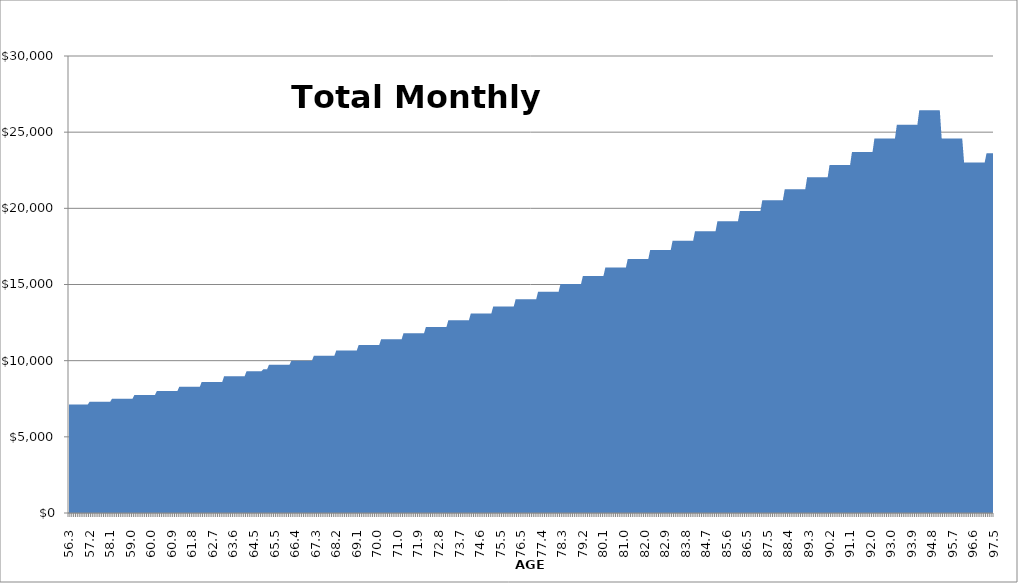
| Category | Total Monthly Expenses |
|---|---|
| 56.3 | 7116.195 |
| 56.4 | 7116.195 |
| 56.5 | 7116.195 |
| 56.5 | 7116.195 |
| 56.6 | 7116.195 |
| 56.7 | 7116.195 |
| 56.8 | 7116.195 |
| 56.9 | 7116.195 |
| 57.0 | 7116.195 |
| 57.0 | 7116.195 |
| 57.1 | 7116.195 |
| 57.2 | 7297.898 |
| 57.3 | 7297.898 |
| 57.4 | 7297.898 |
| 57.5 | 7297.898 |
| 57.5 | 7297.898 |
| 57.6 | 7297.898 |
| 57.7 | 7297.898 |
| 57.8 | 7297.898 |
| 57.9 | 7297.898 |
| 58.0 | 7297.898 |
| 58.0 | 7297.898 |
| 58.1 | 7297.898 |
| 58.2 | 7500.797 |
| 58.3 | 7500.797 |
| 58.4 | 7500.797 |
| 58.5 | 7500.797 |
| 58.5 | 7500.797 |
| 58.6 | 7500.797 |
| 58.7 | 7500.797 |
| 58.8 | 7500.797 |
| 58.9 | 7500.797 |
| 59.0 | 7500.797 |
| 59.0 | 7500.797 |
| 59.1 | 7500.797 |
| 59.2 | 7746.349 |
| 59.3 | 7746.349 |
| 59.4 | 7746.349 |
| 59.5 | 7746.349 |
| 59.5 | 7746.349 |
| 59.6 | 7746.349 |
| 59.7 | 7746.349 |
| 59.8 | 7746.349 |
| 59.9 | 7746.349 |
| 60.0 | 7746.349 |
| 60.0 | 7746.349 |
| 60.1 | 7746.349 |
| 60.2 | 8009.416 |
| 60.3 | 8009.416 |
| 60.4 | 8009.416 |
| 60.5 | 8009.416 |
| 60.5 | 8009.416 |
| 60.6 | 8009.416 |
| 60.7 | 8009.416 |
| 60.8 | 8009.416 |
| 60.9 | 8009.416 |
| 61.0 | 8009.416 |
| 61.0 | 8009.416 |
| 61.1 | 8009.416 |
| 61.2 | 8283.928 |
| 61.3 | 8283.928 |
| 61.4 | 8283.928 |
| 61.5 | 8283.928 |
| 61.5 | 8283.928 |
| 61.6 | 8283.928 |
| 61.7 | 8283.928 |
| 61.8 | 8283.928 |
| 61.9 | 8283.928 |
| 62.0 | 8283.928 |
| 62.0 | 8283.928 |
| 62.1 | 8283.928 |
| 62.2 | 8606.716 |
| 62.3 | 8606.716 |
| 62.4 | 8606.716 |
| 62.5 | 8606.716 |
| 62.5 | 8606.716 |
| 62.6 | 8606.716 |
| 62.7 | 8606.716 |
| 62.8 | 8606.716 |
| 62.9 | 8606.716 |
| 63.0 | 8606.716 |
| 63.0 | 8606.716 |
| 63.1 | 8606.716 |
| 63.2 | 8980.639 |
| 63.3 | 8980.639 |
| 63.4 | 8980.639 |
| 63.5 | 8980.639 |
| 63.5 | 8980.639 |
| 63.6 | 8980.639 |
| 63.7 | 8980.639 |
| 63.8 | 8980.639 |
| 63.9 | 8980.639 |
| 64.0 | 8980.639 |
| 64.0 | 8980.639 |
| 64.1 | 8980.639 |
| 64.2 | 9305.634 |
| 64.3 | 9305.634 |
| 64.4 | 9305.634 |
| 64.5 | 9305.634 |
| 64.5 | 9305.634 |
| 64.6 | 9305.634 |
| 64.7 | 9305.634 |
| 64.8 | 9305.634 |
| 64.9 | 9305.634 |
| 65.0 | 9430.967 |
| 65.0 | 9430.967 |
| 65.1 | 9430.967 |
| 65.2 | 9731.412 |
| 65.3 | 9731.412 |
| 65.4 | 9731.412 |
| 65.5 | 9731.412 |
| 65.5 | 9731.412 |
| 65.6 | 9731.412 |
| 65.7 | 9731.412 |
| 65.8 | 9731.412 |
| 65.9 | 9731.412 |
| 66.0 | 9731.412 |
| 66.0 | 9731.412 |
| 66.1 | 9731.412 |
| 66.2 | 9993.343 |
| 66.3 | 9993.343 |
| 66.4 | 9993.343 |
| 66.5 | 9993.343 |
| 66.5 | 9993.343 |
| 66.6 | 9993.343 |
| 66.7 | 9993.343 |
| 66.8 | 9993.343 |
| 66.9 | 9993.343 |
| 67.0 | 9993.343 |
| 67.0 | 9993.343 |
| 67.1 | 9993.343 |
| 67.2 | 10315.372 |
| 67.3 | 10315.372 |
| 67.4 | 10315.372 |
| 67.5 | 10315.372 |
| 67.5 | 10315.372 |
| 67.6 | 10315.372 |
| 67.7 | 10315.372 |
| 67.8 | 10315.372 |
| 67.9 | 10315.372 |
| 68.0 | 10315.372 |
| 68.0 | 10315.372 |
| 68.1 | 10315.372 |
| 68.2 | 10661.451 |
| 68.3 | 10661.451 |
| 68.4 | 10661.451 |
| 68.5 | 10661.451 |
| 68.5 | 10661.451 |
| 68.6 | 10661.451 |
| 68.7 | 10661.451 |
| 68.8 | 10661.451 |
| 68.9 | 10661.451 |
| 69.0 | 10661.451 |
| 69.0 | 10661.451 |
| 69.1 | 10661.451 |
| 69.2 | 11022.848 |
| 69.3 | 11022.848 |
| 69.4 | 11022.848 |
| 69.5 | 11022.848 |
| 69.5 | 11022.848 |
| 69.6 | 11022.848 |
| 69.7 | 11022.848 |
| 69.8 | 11022.848 |
| 69.9 | 11022.848 |
| 70.0 | 11022.848 |
| 70.0 | 11022.848 |
| 70.1 | 11022.848 |
| 70.2 | 11402.931 |
| 70.3 | 11402.931 |
| 70.4 | 11402.931 |
| 70.5 | 11402.931 |
| 70.5 | 11402.931 |
| 70.6 | 11402.931 |
| 70.7 | 11402.931 |
| 70.8 | 11402.931 |
| 70.9 | 11402.931 |
| 71.0 | 11402.931 |
| 71.0 | 11402.931 |
| 71.1 | 11402.931 |
| 71.2 | 11802.2 |
| 71.3 | 11802.2 |
| 71.4 | 11802.2 |
| 71.5 | 11802.2 |
| 71.5 | 11802.2 |
| 71.6 | 11802.2 |
| 71.7 | 11802.2 |
| 71.8 | 11802.2 |
| 71.9 | 11802.2 |
| 72.0 | 11802.2 |
| 72.0 | 11802.2 |
| 72.1 | 11802.2 |
| 72.2 | 12217.071 |
| 72.3 | 12217.071 |
| 72.4 | 12217.071 |
| 72.5 | 12217.071 |
| 72.5 | 12217.071 |
| 72.6 | 12217.071 |
| 72.7 | 12217.071 |
| 72.8 | 12217.071 |
| 72.9 | 12217.071 |
| 73.0 | 12217.071 |
| 73.0 | 12217.071 |
| 73.1 | 12217.071 |
| 73.2 | 12646.913 |
| 73.3 | 12646.913 |
| 73.4 | 12646.913 |
| 73.5 | 12646.913 |
| 73.5 | 12646.913 |
| 73.6 | 12646.913 |
| 73.7 | 12646.913 |
| 73.8 | 12646.913 |
| 73.9 | 12646.913 |
| 74.0 | 12646.913 |
| 74.0 | 12646.913 |
| 74.1 | 12646.913 |
| 74.2 | 13091.924 |
| 74.3 | 13091.924 |
| 74.4 | 13091.924 |
| 74.5 | 13091.924 |
| 74.5 | 13091.924 |
| 74.6 | 13091.924 |
| 74.7 | 13091.924 |
| 74.8 | 13091.924 |
| 74.9 | 13091.924 |
| 75.0 | 13091.924 |
| 75.0 | 13091.924 |
| 75.1 | 13091.924 |
| 75.2 | 13552.545 |
| 75.3 | 13552.545 |
| 75.4 | 13552.545 |
| 75.5 | 13552.545 |
| 75.5 | 13552.545 |
| 75.6 | 13552.545 |
| 75.7 | 13552.545 |
| 75.8 | 13552.545 |
| 75.9 | 13552.545 |
| 76.0 | 13552.545 |
| 76.0 | 13552.545 |
| 76.1 | 13552.545 |
| 76.2 | 14029.298 |
| 76.3 | 14029.298 |
| 76.4 | 14029.298 |
| 76.5 | 14029.298 |
| 76.5 | 14029.298 |
| 76.6 | 14029.298 |
| 76.7 | 14029.298 |
| 76.8 | 14029.298 |
| 76.9 | 14029.298 |
| 77.0 | 14029.298 |
| 77.0 | 14029.298 |
| 77.1 | 14029.298 |
| 77.2 | 14522.739 |
| 77.3 | 14522.739 |
| 77.4 | 14522.739 |
| 77.5 | 14522.739 |
| 77.5 | 14522.739 |
| 77.6 | 14522.739 |
| 77.7 | 14522.739 |
| 77.8 | 14522.739 |
| 77.9 | 14522.739 |
| 78.0 | 14522.739 |
| 78.0 | 14522.739 |
| 78.1 | 14522.739 |
| 78.2 | 15033.451 |
| 78.3 | 15033.451 |
| 78.4 | 15033.451 |
| 78.5 | 15033.451 |
| 78.5 | 15033.451 |
| 78.6 | 15033.451 |
| 78.7 | 15033.451 |
| 78.8 | 15033.451 |
| 78.9 | 15033.451 |
| 79.0 | 15033.451 |
| 79.0 | 15033.451 |
| 79.1 | 15033.451 |
| 79.2 | 15562.038 |
| 79.3 | 15562.038 |
| 79.4 | 15562.038 |
| 79.5 | 15562.038 |
| 79.5 | 15562.038 |
| 79.6 | 15562.038 |
| 79.7 | 15562.038 |
| 79.8 | 15562.038 |
| 79.9 | 15562.038 |
| 80.0 | 15562.038 |
| 80.0 | 15562.038 |
| 80.1 | 15562.038 |
| 80.2 | 16109.126 |
| 80.3 | 16109.126 |
| 80.4 | 16109.126 |
| 80.5 | 16109.126 |
| 80.5 | 16109.126 |
| 80.6 | 16109.126 |
| 80.7 | 16109.126 |
| 80.8 | 16109.126 |
| 80.9 | 16109.126 |
| 81.0 | 16109.126 |
| 81.0 | 16109.126 |
| 81.1 | 16109.126 |
| 81.2 | 16675.363 |
| 81.3 | 16675.363 |
| 81.4 | 16675.363 |
| 81.5 | 16675.363 |
| 81.5 | 16675.363 |
| 81.6 | 16675.363 |
| 81.7 | 16675.363 |
| 81.8 | 16675.363 |
| 81.9 | 16675.363 |
| 82.0 | 16675.363 |
| 82.0 | 16675.363 |
| 82.1 | 16675.363 |
| 82.2 | 17262.141 |
| 82.3 | 17262.141 |
| 82.4 | 17262.141 |
| 82.5 | 17262.141 |
| 82.5 | 17262.141 |
| 82.6 | 17262.141 |
| 82.7 | 17262.141 |
| 82.8 | 17262.141 |
| 82.9 | 17262.141 |
| 83.0 | 17262.141 |
| 83.0 | 17262.141 |
| 83.1 | 17262.141 |
| 83.2 | 17870.418 |
| 83.3 | 17870.418 |
| 83.4 | 17870.418 |
| 83.5 | 17870.418 |
| 83.5 | 17870.418 |
| 83.6 | 17870.418 |
| 83.7 | 17870.418 |
| 83.8 | 17870.418 |
| 83.9 | 17870.418 |
| 84.0 | 17870.418 |
| 84.0 | 17870.418 |
| 84.1 | 17870.418 |
| 84.2 | 18500.253 |
| 84.3 | 18500.253 |
| 84.4 | 18500.253 |
| 84.5 | 18500.253 |
| 84.5 | 18500.253 |
| 84.6 | 18500.253 |
| 84.7 | 18500.253 |
| 84.8 | 18500.253 |
| 84.9 | 18500.253 |
| 85.0 | 18500.253 |
| 85.0 | 18500.253 |
| 85.1 | 18500.253 |
| 85.2 | 19152.208 |
| 85.3 | 19152.208 |
| 85.4 | 19152.208 |
| 85.5 | 19152.208 |
| 85.5 | 19152.208 |
| 85.6 | 19152.208 |
| 85.7 | 19152.208 |
| 85.8 | 19152.208 |
| 85.9 | 19152.208 |
| 86.0 | 19152.208 |
| 86.0 | 19152.208 |
| 86.1 | 19152.208 |
| 86.2 | 19827.002 |
| 86.3 | 19827.002 |
| 86.4 | 19827.002 |
| 86.5 | 19827.002 |
| 86.5 | 19827.002 |
| 86.6 | 19827.002 |
| 86.7 | 19827.002 |
| 86.8 | 19827.002 |
| 86.9 | 19827.002 |
| 87.0 | 19827.002 |
| 87.0 | 19827.002 |
| 87.1 | 19827.002 |
| 87.2 | 20525.419 |
| 87.3 | 20525.419 |
| 87.4 | 20525.419 |
| 87.5 | 20525.419 |
| 87.5 | 20525.419 |
| 87.6 | 20525.419 |
| 87.7 | 20525.419 |
| 87.8 | 20525.419 |
| 87.9 | 20525.419 |
| 88.0 | 20525.419 |
| 88.0 | 20525.419 |
| 88.1 | 20525.419 |
| 88.2 | 21254.071 |
| 88.3 | 21254.071 |
| 88.4 | 21254.071 |
| 88.5 | 21254.071 |
| 88.5 | 21254.071 |
| 88.6 | 21254.071 |
| 88.7 | 21254.071 |
| 88.8 | 21254.071 |
| 88.9 | 21254.071 |
| 89.0 | 21254.071 |
| 89.0 | 21254.071 |
| 89.1 | 21254.071 |
| 89.2 | 22035.113 |
| 89.3 | 22035.113 |
| 89.4 | 22035.113 |
| 89.5 | 22035.113 |
| 89.5 | 22035.113 |
| 89.6 | 22035.113 |
| 89.7 | 22035.113 |
| 89.8 | 22035.113 |
| 89.9 | 22035.113 |
| 90.0 | 22035.113 |
| 90.0 | 22035.113 |
| 90.1 | 22035.113 |
| 90.2 | 22852.153 |
| 90.3 | 22852.153 |
| 90.4 | 22852.153 |
| 90.5 | 22852.153 |
| 90.5 | 22852.153 |
| 90.6 | 22852.153 |
| 90.7 | 22852.153 |
| 90.8 | 22852.153 |
| 90.9 | 22852.153 |
| 91.0 | 22852.153 |
| 91.0 | 22852.153 |
| 91.1 | 22852.153 |
| 91.2 | 23700.579 |
| 91.3 | 23700.579 |
| 91.4 | 23700.579 |
| 91.5 | 23700.579 |
| 91.5 | 23700.579 |
| 91.6 | 23700.579 |
| 91.7 | 23700.579 |
| 91.8 | 23700.579 |
| 91.9 | 23700.579 |
| 92.0 | 23700.579 |
| 92.0 | 23700.579 |
| 92.1 | 23700.579 |
| 92.2 | 24579.598 |
| 92.3 | 24579.598 |
| 92.4 | 24579.598 |
| 92.5 | 24579.598 |
| 92.5 | 24579.598 |
| 92.6 | 24579.598 |
| 92.7 | 24579.598 |
| 92.8 | 24579.598 |
| 92.9 | 24579.598 |
| 93.0 | 24579.598 |
| 93.0 | 24579.598 |
| 93.1 | 24579.598 |
| 93.2 | 25489.673 |
| 93.3 | 25489.673 |
| 93.4 | 25489.673 |
| 93.5 | 25489.673 |
| 93.5 | 25489.673 |
| 93.6 | 25489.673 |
| 93.7 | 25489.673 |
| 93.8 | 25489.673 |
| 93.9 | 25489.673 |
| 94.0 | 25489.673 |
| 94.0 | 25489.673 |
| 94.1 | 25489.673 |
| 94.2 | 26431.694 |
| 94.3 | 26431.694 |
| 94.4 | 26431.694 |
| 94.5 | 26431.694 |
| 94.5 | 26431.694 |
| 94.6 | 26431.694 |
| 94.7 | 26431.694 |
| 94.8 | 26431.694 |
| 94.9 | 26431.694 |
| 95.0 | 26431.694 |
| 95.0 | 26431.694 |
| 95.1 | 26431.694 |
| 95.2 | 24582.993 |
| 95.3 | 24582.993 |
| 95.4 | 24582.993 |
| 95.5 | 24582.993 |
| 95.5 | 24582.993 |
| 95.6 | 24582.993 |
| 95.7 | 24582.993 |
| 95.8 | 24582.993 |
| 95.9 | 24582.993 |
| 96.0 | 24582.993 |
| 96.0 | 24582.993 |
| 96.1 | 24582.993 |
| 96.2 | 23009.852 |
| 96.3 | 23009.852 |
| 96.4 | 23009.852 |
| 96.5 | 23009.852 |
| 96.5 | 23009.852 |
| 96.6 | 23009.852 |
| 96.7 | 23009.852 |
| 96.8 | 23009.852 |
| 96.9 | 23009.852 |
| 97.0 | 23009.852 |
| 97.0 | 23009.852 |
| 97.1 | 23009.852 |
| 97.2 | 23612.886 |
| 97.3 | 23612.886 |
| 97.4 | 23612.886 |
| 97.5 | 23612.886 |
| 97.5 | 23612.886 |